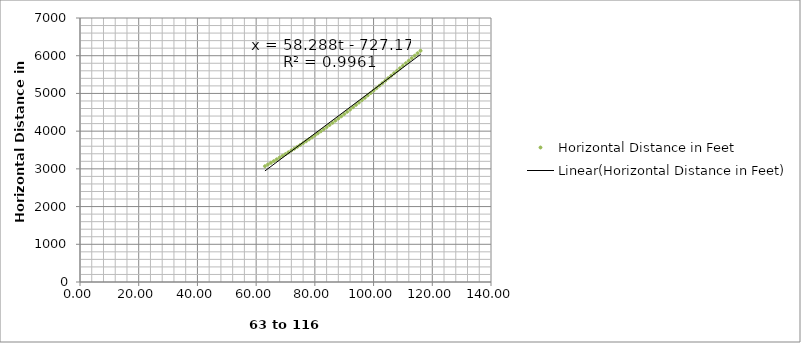
| Category | Horizontal Distance in Feet |
|---|---|
| 63.0 | 3069.032 |
| 64.0 | 3114.455 |
| 65.0 | 3159.928 |
| 66.0 | 3205.608 |
| 67.0 | 3251.938 |
| 68.0 | 3298.421 |
| 69.0 | 3345.098 |
| 70.0 | 3391.825 |
| 71.0 | 3439.024 |
| 72.0 | 3486.805 |
| 73.0 | 3534.479 |
| 74.0 | 3583.195 |
| 75.0 | 3631.664 |
| 76.0 | 3681.449 |
| 77.0 | 3731.678 |
| 78.0 | 3782.831 |
| 79.0 | 3834.708 |
| 80.0 | 3887.79 |
| 81.0 | 3941.208 |
| 82.0 | 3995.658 |
| 83.0 | 4050.988 |
| 84.0 | 4107.06 |
| 85.0 | 4163.566 |
| 86.0 | 4220.356 |
| 87.0 | 4277.891 |
| 88.0 | 4335.77 |
| 89.0 | 4394.167 |
| 90.0 | 4452.954 |
| 91.0 | 4512.859 |
| 92.0 | 4573.208 |
| 93.0 | 4634.442 |
| 94.0 | 4695.929 |
| 95.0 | 4757.993 |
| 96.0 | 4820.634 |
| 97.0 | 4883.457 |
| 98.0 | 4946.791 |
| 99.0 | 5010.704 |
| 100.0 | 5074.908 |
| 101.0 | 5139.807 |
| 102.0 | 5205.226 |
| 103.0 | 5271.337 |
| 104.0 | 5337.045 |
| 105.0 | 5403.044 |
| 106.0 | 5469.046 |
| 107.0 | 5535.158 |
| 108.0 | 5601.269 |
| 109.0 | 5667.383 |
| 110.0 | 5733.786 |
| 111.0 | 5800.076 |
| 112.0 | 5866.367 |
| 113.0 | 5933.056 |
| 114.0 | 5999.458 |
| 115.0 | 6065.859 |
| 116.0 | 6132.149 |